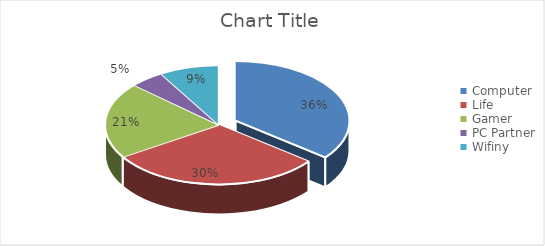
| Category | Series 0 |
|---|---|
| Computer | 14026 |
| Life | 11990 |
| Gamer | 8159 |
| PC Partner | 1913 |
| Wifiny | 3354 |